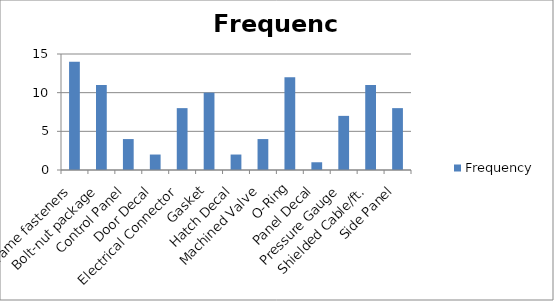
| Category | Frequency |
|---|---|
| Airframe fasteners | 14 |
| Bolt-nut package | 11 |
| Control Panel | 4 |
| Door Decal | 2 |
| Electrical Connector | 8 |
| Gasket | 10 |
| Hatch Decal | 2 |
| Machined Valve | 4 |
| O-Ring | 12 |
| Panel Decal | 1 |
| Pressure Gauge | 7 |
| Shielded Cable/ft. | 11 |
| Side Panel | 8 |